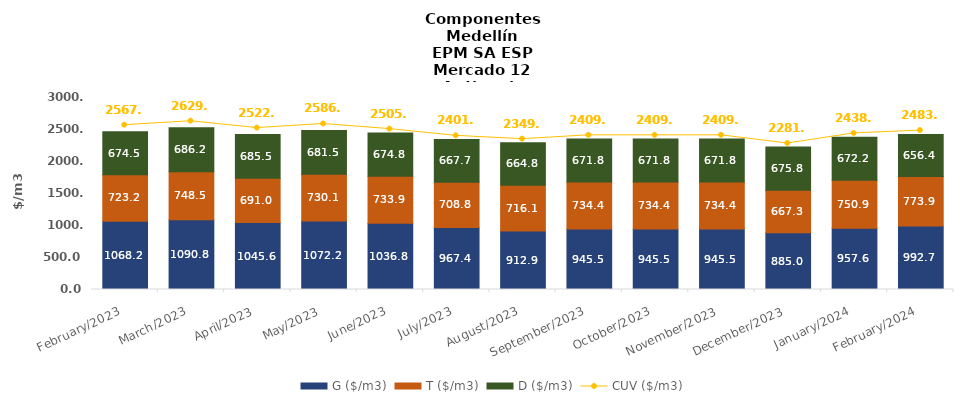
| Category | G ($/m3) | T ($/m3) | D ($/m3) |
|---|---|---|---|
| 2023-02-01 | 1068.19 | 723.22 | 674.52 |
| 2023-03-01 | 1090.77 | 748.48 | 686.22 |
| 2023-04-01 | 1045.58 | 690.98 | 685.49 |
| 2023-05-01 | 1072.19 | 730.14 | 681.45 |
| 2023-06-01 | 1036.8 | 733.9 | 674.81 |
| 2023-07-01 | 967.35 | 708.84 | 667.66 |
| 2023-08-01 | 912.93 | 716.07 | 664.76 |
| 2023-09-01 | 945.5 | 734.35 | 671.79 |
| 2023-10-01 | 945.5 | 734.35 | 671.79 |
| 2023-11-01 | 945.5 | 734.35 | 671.79 |
| 2023-12-01 | 884.98 | 667.31 | 675.79 |
| 2024-01-01 | 957.58 | 750.85 | 672.19 |
| 2024-02-01 | 992.68 | 773.94 | 656.36 |